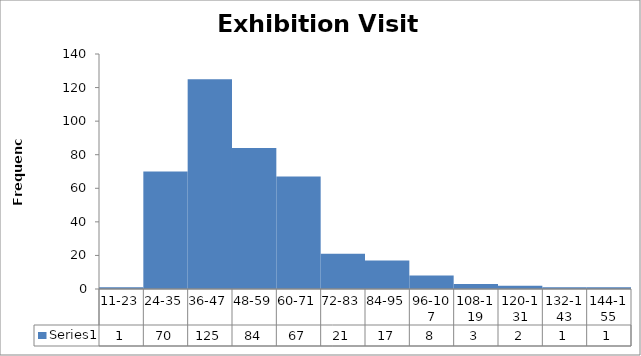
| Category | Series 0 |
|---|---|
| 11-23 | 1 |
| 24-35 | 70 |
| 36-47 | 125 |
| 48-59 | 84 |
| 60-71 | 67 |
| 72-83 | 21 |
| 84-95 | 17 |
| 96-107 | 8 |
| 108-119 | 3 |
| 120-131 | 2 |
| 132-143 | 1 |
| 144-155 | 1 |